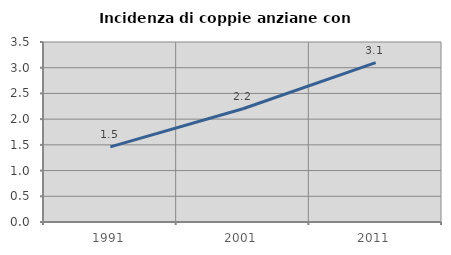
| Category | Incidenza di coppie anziane con figli |
|---|---|
| 1991.0 | 1.461 |
| 2001.0 | 2.202 |
| 2011.0 | 3.099 |